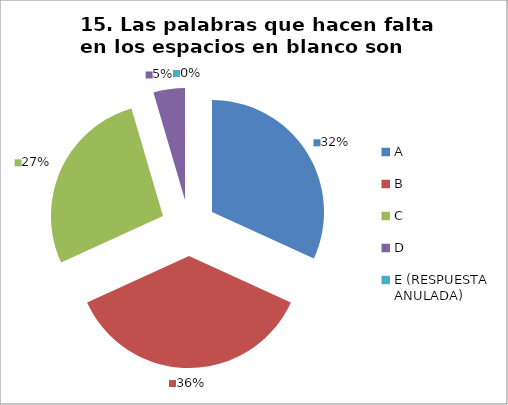
| Category | CANTIDAD DE RESPUESTAS PREGUNTA (15) | PORCENTAJE |
|---|---|---|
| A | 7 | 0.318 |
| B | 8 | 0.364 |
| C | 6 | 0.273 |
| D | 1 | 0.045 |
| E (RESPUESTA ANULADA) | 0 | 0 |